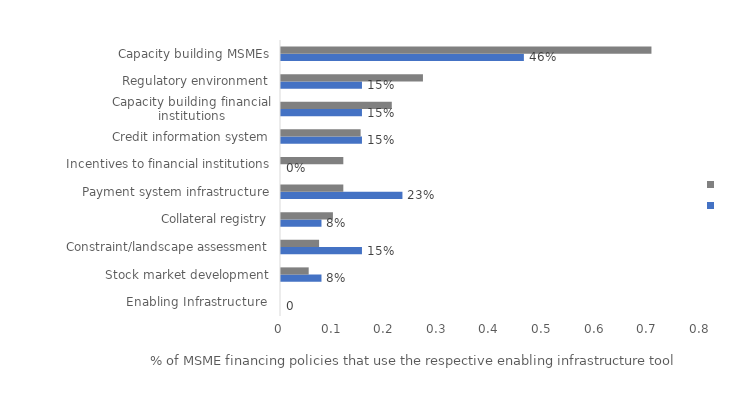
| Category | Series 0 | Series 1 |
|---|---|---|
| Enabling Infrastructure  | 0 | 0 |
| Stock market development | 0.077 | 0.053 |
| Constraint/landscape assessment | 0.154 | 0.072 |
| Collateral registry | 0.077 | 0.099 |
| Payment system infrastructure | 0.231 | 0.118 |
| Incentives to financial institutions | 0 | 0.118 |
| Credit information system | 0.154 | 0.151 |
| Capacity building financial institutions | 0.154 | 0.211 |
| Regulatory environment | 0.154 | 0.27 |
| Capacity building MSMEs | 0.462 | 0.704 |